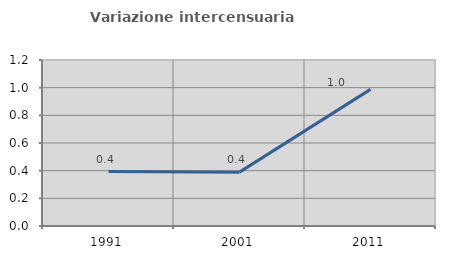
| Category | Variazione intercensuaria annua |
|---|---|
| 1991.0 | 0.394 |
| 2001.0 | 0.389 |
| 2011.0 | 0.988 |